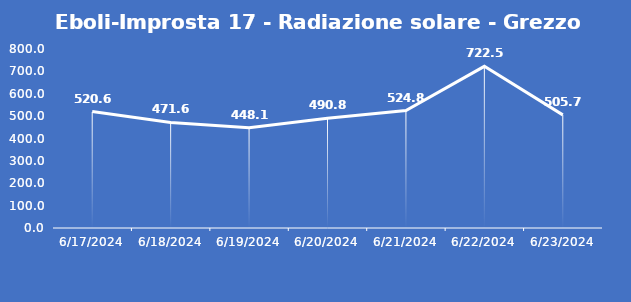
| Category | Eboli-Improsta 17 - Radiazione solare - Grezzo (W/m2) |
|---|---|
| 6/17/24 | 520.6 |
| 6/18/24 | 471.6 |
| 6/19/24 | 448.1 |
| 6/20/24 | 490.8 |
| 6/21/24 | 524.8 |
| 6/22/24 | 722.5 |
| 6/23/24 | 505.7 |